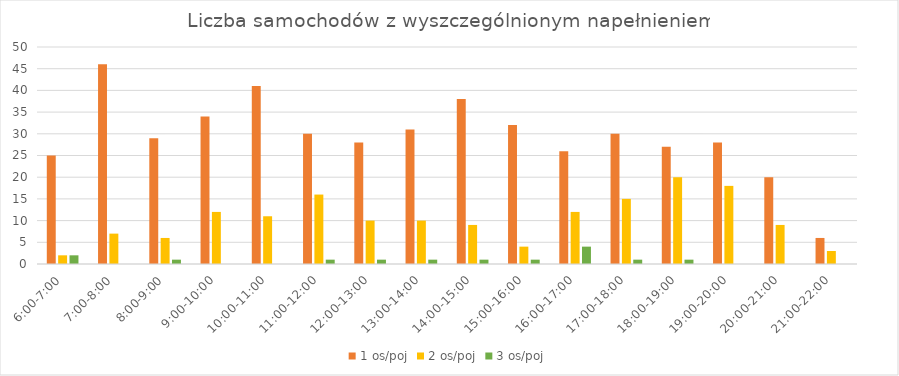
| Category | 1 os/poj | 2 os/poj | 3 os/poj |
|---|---|---|---|
| 6:00-7:00 | 25 | 2 | 2 |
| 7:00-8:00 | 46 | 7 | 0 |
| 8:00-9:00 | 29 | 6 | 1 |
| 9:00-10:00 | 34 | 12 | 0 |
| 10:00-11:00 | 41 | 11 | 0 |
| 11:00-12:00 | 30 | 16 | 1 |
| 12:00-13:00 | 28 | 10 | 1 |
| 13:00-14:00 | 31 | 10 | 1 |
| 14:00-15:00 | 38 | 9 | 1 |
| 15:00-16:00 | 32 | 4 | 1 |
| 16:00-17:00 | 26 | 12 | 4 |
| 17:00-18:00 | 30 | 15 | 1 |
| 18:00-19:00 | 27 | 20 | 1 |
| 19:00-20:00 | 28 | 18 | 0 |
| 20:00-21:00 | 20 | 9 | 0 |
| 21:00-22:00 | 6 | 3 | 0 |